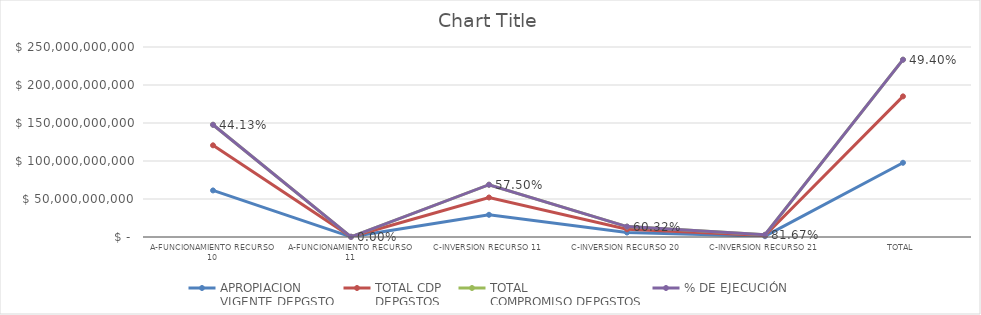
| Category | APROPIACION
VIGENTE DEPGSTO | TOTAL CDP
DEPGSTOS | TOTAL
COMPROMISO DEPGSTOS | % DE EJECUCIÓN |
|---|---|---|---|---|
| A-FUNCIONAMIENTO RECURSO 10 | 61276091000 | 59359337407.6 | 27041700704.19 | 0.441 |
| A-FUNCIONAMIENTO RECURSO 11 | 244200000 | 0 | 0 | 0 |
| C-INVERSION RECURSO 11 | 29225074635 | 22764983624 | 16803420903 | 0.575 |
| C-INVERSION RECURSO 20 | 5882000000 | 4245587776 | 3548179478 | 0.603 |
| C-INVERSION RECURSO 21 | 1053910847 | 989913745 | 860750891 | 0.817 |
| TOTAL | 97681276482 | 87359822552.6 | 48254051976.19 | 0.494 |